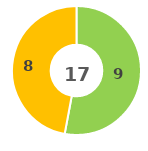
| Category | Series 0 |
|---|---|
| 0 | 0 |
| 1 | 9 |
| 2 | 8 |
| 3 | 0 |
| 4 | 0 |